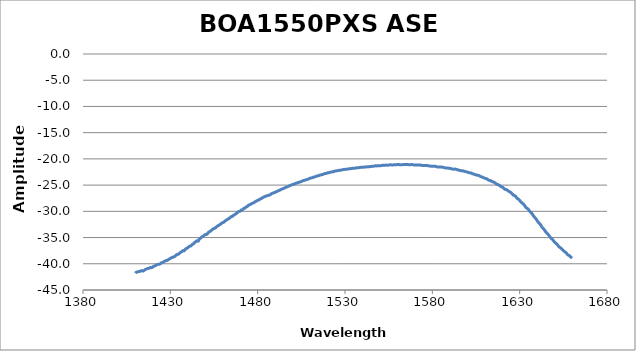
| Category | Amplitude (dB) |
|---|---|
| 1410.0 | -41.791 |
| 1410.5 | -41.615 |
| 1411.0 | -41.567 |
| 1411.5 | -41.53 |
| 1412.0 | -41.47 |
| 1412.5 | -41.46 |
| 1413.0 | -41.375 |
| 1413.5 | -41.319 |
| 1414.0 | -41.311 |
| 1414.5 | -41.385 |
| 1415.0 | -41.264 |
| 1415.5 | -41.13 |
| 1416.0 | -41.042 |
| 1416.5 | -40.966 |
| 1417.0 | -40.901 |
| 1417.5 | -40.874 |
| 1418.0 | -40.841 |
| 1418.5 | -40.713 |
| 1419.0 | -40.74 |
| 1419.5 | -40.721 |
| 1420.0 | -40.584 |
| 1420.5 | -40.475 |
| 1421.0 | -40.412 |
| 1421.5 | -40.334 |
| 1422.0 | -40.256 |
| 1422.5 | -40.16 |
| 1423.0 | -40.116 |
| 1423.5 | -40.083 |
| 1424.0 | -40.055 |
| 1424.5 | -39.932 |
| 1425.0 | -39.792 |
| 1425.5 | -39.759 |
| 1426.0 | -39.683 |
| 1426.5 | -39.565 |
| 1427.0 | -39.47 |
| 1427.5 | -39.425 |
| 1428.0 | -39.348 |
| 1428.5 | -39.3 |
| 1429.0 | -39.192 |
| 1429.5 | -39.07 |
| 1430.0 | -38.979 |
| 1430.5 | -38.88 |
| 1431.0 | -38.771 |
| 1431.5 | -38.768 |
| 1432.0 | -38.677 |
| 1432.5 | -38.599 |
| 1433.0 | -38.472 |
| 1433.5 | -38.283 |
| 1434.0 | -38.209 |
| 1434.5 | -38.199 |
| 1435.0 | -38.06 |
| 1435.5 | -37.895 |
| 1436.0 | -37.793 |
| 1436.5 | -37.713 |
| 1437.0 | -37.54 |
| 1437.5 | -37.483 |
| 1438.0 | -37.498 |
| 1438.5 | -37.272 |
| 1439.0 | -37.108 |
| 1439.5 | -37.045 |
| 1440.0 | -36.956 |
| 1440.5 | -36.759 |
| 1441.0 | -36.651 |
| 1441.5 | -36.623 |
| 1442.0 | -36.521 |
| 1442.5 | -36.322 |
| 1443.0 | -36.245 |
| 1443.5 | -36.1 |
| 1444.0 | -35.905 |
| 1444.5 | -35.81 |
| 1445.0 | -35.664 |
| 1445.5 | -35.599 |
| 1446.0 | -35.69 |
| 1446.5 | -35.339 |
| 1447.0 | -35.174 |
| 1447.5 | -35.056 |
| 1448.0 | -34.903 |
| 1448.5 | -34.798 |
| 1449.0 | -34.685 |
| 1449.5 | -34.537 |
| 1450.0 | -34.436 |
| 1450.5 | -34.399 |
| 1451.0 | -34.374 |
| 1451.5 | -34.145 |
| 1452.0 | -33.956 |
| 1452.5 | -33.897 |
| 1453.0 | -33.75 |
| 1453.5 | -33.618 |
| 1454.0 | -33.474 |
| 1454.5 | -33.375 |
| 1455.0 | -33.26 |
| 1455.5 | -33.22 |
| 1456.0 | -33.073 |
| 1456.5 | -32.933 |
| 1457.0 | -32.807 |
| 1457.5 | -32.701 |
| 1458.0 | -32.622 |
| 1458.5 | -32.489 |
| 1459.0 | -32.367 |
| 1459.5 | -32.245 |
| 1460.0 | -32.152 |
| 1460.5 | -32.096 |
| 1461.0 | -31.927 |
| 1461.5 | -31.81 |
| 1462.0 | -31.693 |
| 1462.5 | -31.565 |
| 1463.0 | -31.459 |
| 1463.5 | -31.422 |
| 1464.0 | -31.249 |
| 1464.5 | -31.106 |
| 1465.0 | -30.993 |
| 1465.5 | -30.964 |
| 1466.0 | -30.805 |
| 1466.5 | -30.693 |
| 1467.0 | -30.589 |
| 1467.5 | -30.47 |
| 1468.0 | -30.352 |
| 1468.5 | -30.2 |
| 1469.0 | -30.07 |
| 1469.5 | -30.012 |
| 1470.0 | -29.972 |
| 1470.5 | -29.769 |
| 1471.0 | -29.782 |
| 1471.5 | -29.624 |
| 1472.0 | -29.449 |
| 1472.5 | -29.417 |
| 1473.0 | -29.294 |
| 1473.5 | -29.159 |
| 1474.0 | -29.073 |
| 1474.5 | -28.916 |
| 1475.0 | -28.805 |
| 1475.5 | -28.716 |
| 1476.0 | -28.645 |
| 1476.5 | -28.527 |
| 1477.0 | -28.464 |
| 1477.5 | -28.387 |
| 1478.0 | -28.314 |
| 1478.5 | -28.188 |
| 1479.0 | -28.074 |
| 1479.5 | -28.013 |
| 1480.0 | -27.908 |
| 1480.5 | -27.841 |
| 1481.0 | -27.763 |
| 1481.5 | -27.633 |
| 1482.0 | -27.584 |
| 1482.5 | -27.463 |
| 1483.0 | -27.373 |
| 1483.5 | -27.283 |
| 1484.0 | -27.182 |
| 1484.5 | -27.135 |
| 1485.0 | -27.07 |
| 1485.5 | -27.009 |
| 1486.0 | -26.972 |
| 1486.5 | -26.901 |
| 1487.0 | -26.888 |
| 1487.5 | -26.744 |
| 1488.0 | -26.635 |
| 1488.5 | -26.552 |
| 1489.0 | -26.503 |
| 1489.5 | -26.414 |
| 1490.0 | -26.388 |
| 1490.5 | -26.276 |
| 1491.0 | -26.212 |
| 1491.5 | -26.142 |
| 1492.0 | -26.052 |
| 1492.5 | -25.967 |
| 1493.0 | -25.909 |
| 1493.5 | -25.803 |
| 1494.0 | -25.743 |
| 1494.5 | -25.673 |
| 1495.0 | -25.595 |
| 1495.5 | -25.552 |
| 1496.0 | -25.434 |
| 1496.5 | -25.379 |
| 1497.0 | -25.321 |
| 1497.5 | -25.244 |
| 1498.0 | -25.157 |
| 1498.5 | -25.094 |
| 1499.0 | -25.021 |
| 1499.5 | -24.95 |
| 1500.0 | -24.889 |
| 1500.5 | -24.838 |
| 1501.0 | -24.793 |
| 1501.5 | -24.709 |
| 1502.0 | -24.652 |
| 1502.5 | -24.596 |
| 1503.0 | -24.527 |
| 1503.5 | -24.479 |
| 1504.0 | -24.42 |
| 1504.5 | -24.369 |
| 1505.0 | -24.314 |
| 1505.5 | -24.238 |
| 1506.0 | -24.154 |
| 1506.5 | -24.116 |
| 1507.0 | -24.08 |
| 1507.5 | -24.008 |
| 1508.0 | -23.956 |
| 1508.5 | -23.894 |
| 1509.0 | -23.851 |
| 1509.5 | -23.77 |
| 1510.0 | -23.675 |
| 1510.5 | -23.647 |
| 1511.0 | -23.623 |
| 1511.5 | -23.558 |
| 1512.0 | -23.486 |
| 1512.5 | -23.452 |
| 1513.0 | -23.393 |
| 1513.5 | -23.326 |
| 1514.0 | -23.258 |
| 1514.5 | -23.227 |
| 1515.0 | -23.187 |
| 1515.5 | -23.114 |
| 1516.0 | -23.058 |
| 1516.5 | -23.028 |
| 1517.0 | -22.995 |
| 1517.5 | -22.923 |
| 1518.0 | -22.862 |
| 1518.5 | -22.808 |
| 1519.0 | -22.795 |
| 1519.5 | -22.739 |
| 1520.0 | -22.661 |
| 1520.5 | -22.635 |
| 1521.0 | -22.605 |
| 1521.5 | -22.555 |
| 1522.0 | -22.511 |
| 1522.5 | -22.477 |
| 1523.0 | -22.471 |
| 1523.5 | -22.434 |
| 1524.0 | -22.353 |
| 1524.5 | -22.305 |
| 1525.0 | -22.289 |
| 1525.5 | -22.259 |
| 1526.0 | -22.209 |
| 1526.5 | -22.19 |
| 1527.0 | -22.184 |
| 1527.5 | -22.182 |
| 1528.0 | -22.116 |
| 1528.5 | -22.083 |
| 1529.0 | -22.047 |
| 1529.5 | -22.032 |
| 1530.0 | -21.994 |
| 1530.5 | -21.966 |
| 1531.0 | -21.97 |
| 1531.5 | -21.949 |
| 1532.0 | -21.918 |
| 1532.5 | -21.87 |
| 1533.0 | -21.86 |
| 1533.5 | -21.849 |
| 1534.0 | -21.815 |
| 1534.5 | -21.78 |
| 1535.0 | -21.776 |
| 1535.5 | -21.78 |
| 1536.0 | -21.753 |
| 1536.5 | -21.718 |
| 1537.0 | -21.7 |
| 1537.5 | -21.694 |
| 1538.0 | -21.672 |
| 1538.5 | -21.641 |
| 1539.0 | -21.615 |
| 1539.5 | -21.613 |
| 1540.0 | -21.608 |
| 1540.5 | -21.595 |
| 1541.0 | -21.563 |
| 1541.5 | -21.54 |
| 1542.0 | -21.551 |
| 1542.5 | -21.515 |
| 1543.0 | -21.478 |
| 1543.5 | -21.481 |
| 1544.0 | -21.485 |
| 1544.5 | -21.467 |
| 1545.0 | -21.442 |
| 1545.5 | -21.411 |
| 1546.0 | -21.4 |
| 1546.5 | -21.394 |
| 1547.0 | -21.361 |
| 1547.5 | -21.322 |
| 1548.0 | -21.337 |
| 1548.5 | -21.318 |
| 1549.0 | -21.303 |
| 1549.5 | -21.287 |
| 1550.0 | -21.292 |
| 1550.5 | -21.288 |
| 1551.0 | -21.258 |
| 1551.5 | -21.228 |
| 1552.0 | -21.22 |
| 1552.5 | -21.216 |
| 1553.0 | -21.22 |
| 1553.5 | -21.19 |
| 1554.0 | -21.188 |
| 1554.5 | -21.19 |
| 1555.0 | -21.187 |
| 1555.5 | -21.144 |
| 1556.0 | -21.132 |
| 1556.5 | -21.141 |
| 1557.0 | -21.153 |
| 1557.5 | -21.15 |
| 1558.0 | -21.131 |
| 1558.5 | -21.14 |
| 1559.0 | -21.139 |
| 1559.5 | -21.112 |
| 1560.0 | -21.071 |
| 1560.5 | -21.073 |
| 1561.0 | -21.093 |
| 1561.5 | -21.103 |
| 1562.0 | -21.102 |
| 1562.5 | -21.105 |
| 1563.0 | -21.102 |
| 1563.5 | -21.087 |
| 1564.0 | -21.059 |
| 1564.5 | -21.049 |
| 1565.0 | -21.066 |
| 1565.5 | -21.08 |
| 1566.0 | -21.088 |
| 1566.5 | -21.098 |
| 1567.0 | -21.106 |
| 1567.5 | -21.104 |
| 1568.0 | -21.082 |
| 1568.5 | -21.074 |
| 1569.0 | -21.121 |
| 1569.5 | -21.155 |
| 1570.0 | -21.169 |
| 1570.5 | -21.159 |
| 1571.0 | -21.152 |
| 1571.5 | -21.171 |
| 1572.0 | -21.174 |
| 1572.5 | -21.152 |
| 1573.0 | -21.161 |
| 1573.5 | -21.199 |
| 1574.0 | -21.241 |
| 1574.5 | -21.249 |
| 1575.0 | -21.238 |
| 1575.5 | -21.242 |
| 1576.0 | -21.252 |
| 1576.5 | -21.25 |
| 1577.0 | -21.251 |
| 1577.5 | -21.292 |
| 1578.0 | -21.343 |
| 1578.5 | -21.378 |
| 1579.0 | -21.379 |
| 1579.5 | -21.39 |
| 1580.0 | -21.382 |
| 1580.5 | -21.384 |
| 1581.0 | -21.393 |
| 1581.5 | -21.39 |
| 1582.0 | -21.439 |
| 1582.5 | -21.502 |
| 1583.0 | -21.538 |
| 1583.5 | -21.544 |
| 1584.0 | -21.532 |
| 1584.5 | -21.546 |
| 1585.0 | -21.554 |
| 1585.5 | -21.571 |
| 1586.0 | -21.59 |
| 1586.5 | -21.626 |
| 1587.0 | -21.68 |
| 1587.5 | -21.725 |
| 1588.0 | -21.727 |
| 1588.5 | -21.724 |
| 1589.0 | -21.742 |
| 1589.5 | -21.79 |
| 1590.0 | -21.815 |
| 1590.5 | -21.838 |
| 1591.0 | -21.889 |
| 1591.5 | -21.94 |
| 1592.0 | -21.953 |
| 1592.5 | -21.954 |
| 1593.0 | -21.944 |
| 1593.5 | -21.969 |
| 1594.0 | -22.039 |
| 1594.5 | -22.075 |
| 1595.0 | -22.118 |
| 1595.5 | -22.181 |
| 1596.0 | -22.228 |
| 1596.5 | -22.25 |
| 1597.0 | -22.258 |
| 1597.5 | -22.272 |
| 1598.0 | -22.333 |
| 1598.5 | -22.395 |
| 1599.0 | -22.427 |
| 1599.5 | -22.463 |
| 1600.0 | -22.518 |
| 1600.5 | -22.574 |
| 1601.0 | -22.628 |
| 1601.5 | -22.654 |
| 1602.0 | -22.686 |
| 1602.5 | -22.741 |
| 1603.0 | -22.839 |
| 1603.5 | -22.871 |
| 1604.0 | -22.922 |
| 1604.5 | -23.002 |
| 1605.0 | -23.054 |
| 1605.5 | -23.099 |
| 1606.0 | -23.128 |
| 1606.5 | -23.158 |
| 1607.0 | -23.229 |
| 1607.5 | -23.346 |
| 1608.0 | -23.418 |
| 1608.5 | -23.454 |
| 1609.0 | -23.535 |
| 1609.5 | -23.614 |
| 1610.0 | -23.681 |
| 1610.5 | -23.736 |
| 1611.0 | -23.773 |
| 1611.5 | -23.877 |
| 1612.0 | -24.02 |
| 1612.5 | -24.088 |
| 1613.0 | -24.113 |
| 1613.5 | -24.18 |
| 1614.0 | -24.277 |
| 1614.5 | -24.35 |
| 1615.0 | -24.406 |
| 1615.5 | -24.49 |
| 1616.0 | -24.602 |
| 1616.5 | -24.723 |
| 1617.0 | -24.84 |
| 1617.5 | -24.905 |
| 1618.0 | -24.982 |
| 1618.5 | -25.083 |
| 1619.0 | -25.2 |
| 1619.5 | -25.303 |
| 1620.0 | -25.381 |
| 1620.5 | -25.469 |
| 1621.0 | -25.628 |
| 1621.5 | -25.787 |
| 1622.0 | -25.835 |
| 1622.5 | -25.881 |
| 1623.0 | -25.976 |
| 1623.5 | -26.121 |
| 1624.0 | -26.221 |
| 1624.5 | -26.32 |
| 1625.0 | -26.417 |
| 1625.5 | -26.606 |
| 1626.0 | -26.769 |
| 1626.5 | -26.932 |
| 1627.0 | -26.992 |
| 1627.5 | -27.109 |
| 1628.0 | -27.278 |
| 1628.5 | -27.506 |
| 1629.0 | -27.604 |
| 1629.5 | -27.743 |
| 1630.0 | -27.922 |
| 1630.5 | -28.128 |
| 1631.0 | -28.319 |
| 1631.5 | -28.416 |
| 1632.0 | -28.577 |
| 1632.5 | -28.741 |
| 1633.0 | -28.969 |
| 1633.5 | -29.249 |
| 1634.0 | -29.382 |
| 1634.5 | -29.48 |
| 1635.0 | -29.638 |
| 1635.5 | -29.873 |
| 1636.0 | -30.055 |
| 1636.5 | -30.207 |
| 1637.0 | -30.407 |
| 1637.5 | -30.665 |
| 1638.0 | -30.917 |
| 1638.5 | -31.111 |
| 1639.0 | -31.284 |
| 1639.5 | -31.509 |
| 1640.0 | -31.784 |
| 1640.5 | -32.009 |
| 1641.0 | -32.199 |
| 1641.5 | -32.373 |
| 1642.0 | -32.585 |
| 1642.5 | -32.858 |
| 1643.0 | -33.123 |
| 1643.5 | -33.294 |
| 1644.0 | -33.464 |
| 1644.5 | -33.696 |
| 1645.0 | -33.947 |
| 1645.5 | -34.132 |
| 1646.0 | -34.295 |
| 1646.5 | -34.477 |
| 1647.0 | -34.706 |
| 1647.5 | -34.94 |
| 1648.0 | -35.141 |
| 1648.5 | -35.269 |
| 1649.0 | -35.441 |
| 1649.5 | -35.672 |
| 1650.0 | -35.878 |
| 1650.5 | -36.03 |
| 1651.0 | -36.151 |
| 1651.5 | -36.301 |
| 1652.0 | -36.542 |
| 1652.5 | -36.762 |
| 1653.0 | -36.874 |
| 1653.5 | -36.974 |
| 1654.0 | -37.128 |
| 1654.5 | -37.314 |
| 1655.0 | -37.469 |
| 1655.5 | -37.625 |
| 1656.0 | -37.74 |
| 1656.5 | -37.879 |
| 1657.0 | -38.078 |
| 1657.5 | -38.27 |
| 1658.0 | -38.366 |
| 1658.5 | -38.45 |
| 1659.0 | -38.604 |
| 1659.5 | -38.777 |
| 1660.0 | -38.928 |